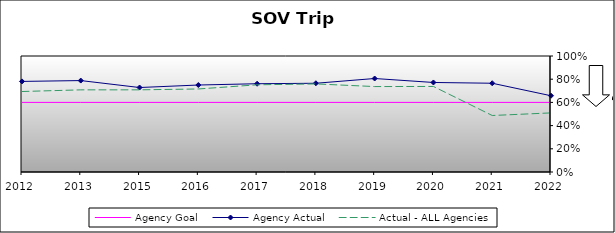
| Category | Agency Goal | Agency Actual | Actual - ALL Agencies |
|---|---|---|---|
| 2012.0 | 0.6 | 0.781 | 0.694 |
| 2013.0 | 0.6 | 0.788 | 0.708 |
| 2015.0 | 0.6 | 0.728 | 0.708 |
| 2016.0 | 0.6 | 0.75 | 0.716 |
| 2017.0 | 0.6 | 0.761 | 0.752 |
| 2018.0 | 0.6 | 0.765 | 0.759 |
| 2019.0 | 0.6 | 0.806 | 0.736 |
| 2020.0 | 0.6 | 0.772 | 0.737 |
| 2021.0 | 0.6 | 0.765 | 0.487 |
| 2022.0 | 0.6 | 0.657 | 0.509 |